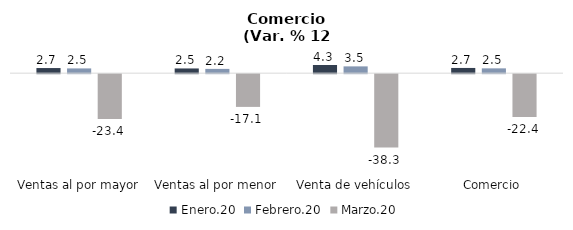
| Category | Enero.20 | Febrero.20 | Marzo.20 |
|---|---|---|---|
| Ventas al por mayor | 2.67 | 2.48 | -23.41 |
| Ventas al por menor | 2.46 | 2.23 | -17.08 |
| Venta de vehículos | 4.25 | 3.54 | -38.29 |
| Comercio | 2.72 | 2.51 | -22.35 |